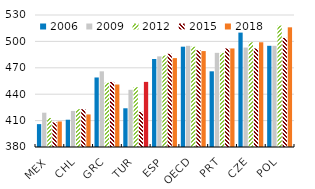
| Category | 2006 | 2009 | 2012 | 2015 | 2018 |
|---|---|---|---|---|---|
| MEX | 406 | 419 | 413 | 408 | 409 |
| CHL | 411 | 421 | 423 | 423 | 417 |
| GRC | 459 | 466 | 453 | 454 | 451 |
| TUR | 424 | 445 | 448 | 420 | 454 |
| ESP | 480 | 483 | 484 | 486 | 481 |
| OECD | 494 | 495 | 494 | 490 | 489 |
| PRT | 466 | 487 | 487 | 492 | 492 |
| CZE | 510 | 493 | 499 | 492 | 499 |
| POL | 495 | 495 | 518 | 504 | 516 |